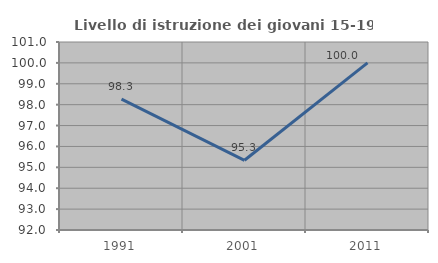
| Category | Livello di istruzione dei giovani 15-19 anni |
|---|---|
| 1991.0 | 98.261 |
| 2001.0 | 95.337 |
| 2011.0 | 100 |